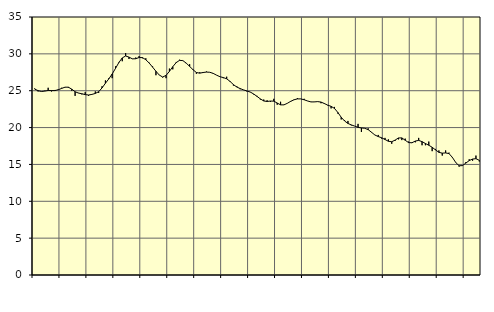
| Category | Piggar | Series 1 |
|---|---|---|
| nan | 25.3 | 25.22 |
| 87.0 | 24.9 | 25.01 |
| 87.0 | 24.9 | 24.89 |
| 87.0 | 25 | 24.95 |
| nan | 25.4 | 25.03 |
| 88.0 | 24.9 | 25.02 |
| 88.0 | 25.1 | 25.02 |
| 88.0 | 25.2 | 25.13 |
| nan | 25.4 | 25.31 |
| 89.0 | 25.5 | 25.48 |
| 89.0 | 25.4 | 25.48 |
| 89.0 | 25 | 25.21 |
| nan | 24.3 | 24.86 |
| 90.0 | 24.7 | 24.68 |
| 90.0 | 24.5 | 24.59 |
| 90.0 | 24.8 | 24.47 |
| nan | 24.3 | 24.42 |
| 91.0 | 24.5 | 24.5 |
| 91.0 | 24.9 | 24.63 |
| 91.0 | 24.7 | 24.87 |
| nan | 25.6 | 25.38 |
| 92.0 | 26.4 | 26.01 |
| 92.0 | 26.7 | 26.6 |
| 92.0 | 26.7 | 27.27 |
| nan | 28.3 | 28.03 |
| 93.0 | 28.9 | 28.83 |
| 93.0 | 29 | 29.45 |
| 93.0 | 30.1 | 29.71 |
| nan | 29.3 | 29.56 |
| 94.0 | 29.3 | 29.32 |
| 94.0 | 29.5 | 29.34 |
| 94.0 | 29.7 | 29.5 |
| nan | 29.4 | 29.49 |
| 95.0 | 29.4 | 29.2 |
| 95.0 | 28.8 | 28.75 |
| 95.0 | 28.3 | 28.2 |
| nan | 27.1 | 27.64 |
| 96.0 | 27.1 | 27.12 |
| 96.0 | 26.8 | 26.86 |
| 96.0 | 26.7 | 27.08 |
| nan | 28 | 27.62 |
| 97.0 | 27.9 | 28.26 |
| 97.0 | 28.9 | 28.81 |
| 97.0 | 29.2 | 29.12 |
| nan | 29.1 | 29.08 |
| 98.0 | 28.7 | 28.74 |
| 98.0 | 28.6 | 28.3 |
| 98.0 | 27.9 | 27.85 |
| nan | 27.3 | 27.47 |
| 99.0 | 27.5 | 27.38 |
| 99.0 | 27.4 | 27.47 |
| 99.0 | 27.6 | 27.53 |
| nan | 27.5 | 27.5 |
| 0.0 | 27.4 | 27.35 |
| 0.0 | 27.1 | 27.11 |
| 0.0 | 26.9 | 26.9 |
| nan | 26.7 | 26.78 |
| 1.0 | 26.9 | 26.62 |
| 1.0 | 26.2 | 26.26 |
| 1.0 | 25.7 | 25.83 |
| nan | 25.6 | 25.5 |
| 2.0 | 25.2 | 25.29 |
| 2.0 | 25.1 | 25.11 |
| 2.0 | 24.9 | 24.97 |
| nan | 24.8 | 24.82 |
| 3.0 | 24.5 | 24.56 |
| 3.0 | 24.3 | 24.23 |
| 3.0 | 23.8 | 23.89 |
| nan | 23.8 | 23.61 |
| 4.0 | 23.7 | 23.54 |
| 4.0 | 23.5 | 23.6 |
| 4.0 | 23.9 | 23.58 |
| nan | 23.1 | 23.33 |
| 5.0 | 23.5 | 23.08 |
| 5.0 | 23.1 | 23.08 |
| 5.0 | 23.3 | 23.29 |
| nan | 23.5 | 23.56 |
| 6.0 | 23.8 | 23.77 |
| 6.0 | 24 | 23.89 |
| 6.0 | 23.9 | 23.89 |
| nan | 23.9 | 23.77 |
| 7.0 | 23.6 | 23.61 |
| 7.0 | 23.5 | 23.48 |
| 7.0 | 23.5 | 23.48 |
| nan | 23.5 | 23.52 |
| 8.0 | 23.3 | 23.46 |
| 8.0 | 23.2 | 23.26 |
| 8.0 | 23 | 23.04 |
| nan | 22.6 | 22.88 |
| 9.0 | 22.8 | 22.6 |
| 9.0 | 21.9 | 22.05 |
| 9.0 | 21.1 | 21.4 |
| nan | 21 | 20.89 |
| 10.0 | 20.9 | 20.56 |
| 10.0 | 20.3 | 20.36 |
| 10.0 | 20.2 | 20.2 |
| nan | 20.5 | 20.03 |
| 11.0 | 19.4 | 19.95 |
| 11.0 | 19.9 | 19.9 |
| 11.0 | 19.9 | 19.72 |
| nan | 19.4 | 19.36 |
| 12.0 | 19 | 18.99 |
| 12.0 | 19 | 18.78 |
| 12.0 | 18.5 | 18.62 |
| nan | 18.6 | 18.38 |
| 13.0 | 18.4 | 18.14 |
| 13.0 | 17.8 | 18.08 |
| 13.0 | 18.2 | 18.3 |
| nan | 18.4 | 18.59 |
| 14.0 | 18.3 | 18.6 |
| 14.0 | 18.5 | 18.28 |
| 14.0 | 18.1 | 17.96 |
| nan | 17.9 | 17.94 |
| 15.0 | 18 | 18.17 |
| 15.0 | 18.6 | 18.26 |
| 15.0 | 17.6 | 18.09 |
| nan | 17.6 | 17.84 |
| 16.0 | 18.1 | 17.6 |
| 16.0 | 16.8 | 17.33 |
| 16.0 | 17.1 | 16.97 |
| nan | 16.9 | 16.64 |
| 17.0 | 16.2 | 16.53 |
| 17.0 | 16.9 | 16.56 |
| 17.0 | 16.6 | 16.47 |
| nan | 15.9 | 15.96 |
| 18.0 | 15.3 | 15.26 |
| 18.0 | 14.7 | 14.82 |
| 18.0 | 14.8 | 14.84 |
| nan | 15.3 | 15.18 |
| 19.0 | 15.7 | 15.52 |
| 19.0 | 15.5 | 15.73 |
| 19.0 | 16.2 | 15.78 |
| nan | 15.4 | 15.56 |